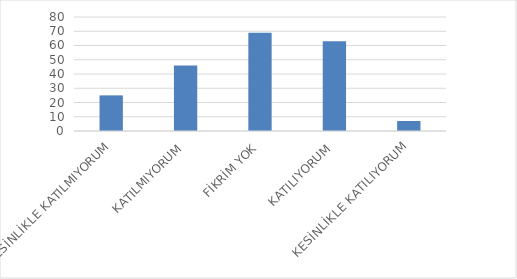
| Category | Series 0 |
|---|---|
| KESİNLİKLE KATILMIYORUM | 25 |
| KATILMIYORUM | 46 |
| FİKRİM YOK | 69 |
| KATILIYORUM | 63 |
| KESİNLİKLE KATILIYORUM | 7 |